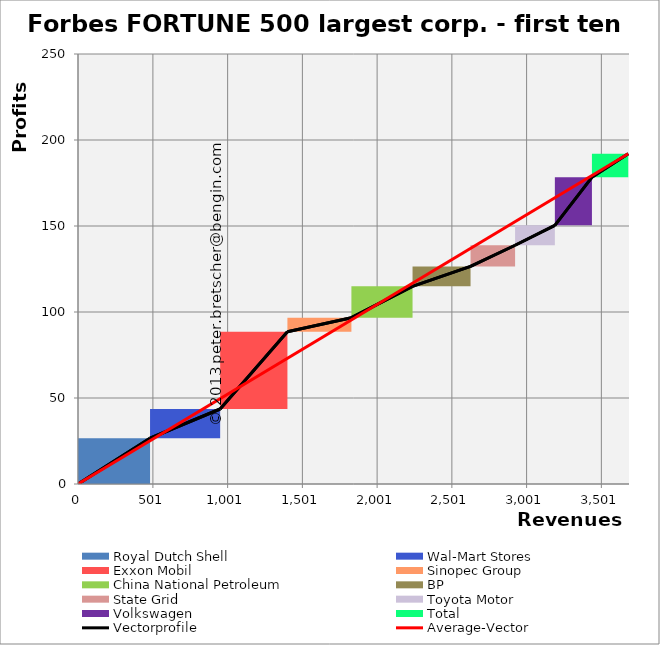
| Category | transparent | Royal Dutch Shell | Wal-Mart Stores | Exxon Mobil | Sinopec Group | China National Petroleum | BP | State Grid | Toyota Motor | Volkswagen | Total | Border right & top |
|---|---|---|---|---|---|---|---|---|---|---|---|---|
| 0.0 | 0 | 26.6 | 0 | 0 | 0 | 0 | 0 | 0 | 0 | 0 | 0 | 0 |
| 481.7 | 0 | 26.6 | 0 | 0 | 0 | 0 | 0 | 0 | 0 | 0 | 0 | 0 |
| 481.7 | 26.6 | 0 | 17 | 0 | 0 | 0 | 0 | 0 | 0 | 0 | 0 | 0 |
| 950.9 | 26.6 | 0 | 17 | 0 | 0 | 0 | 0 | 0 | 0 | 0 | 0 | 0 |
| 950.9 | 43.6 | 0 | 0 | 44.9 | 0 | 0 | 0 | 0 | 0 | 0 | 0 | 0 |
| 1400.8 | 43.6 | 0 | 0 | 44.9 | 0 | 0 | 0 | 0 | 0 | 0 | 0 | 0 |
| 1400.8 | 88.5 | 0 | 0 | 0 | 8.2 | 0 | 0 | 0 | 0 | 0 | 0 | 0 |
| 1829.0 | 88.5 | 0 | 0 | 0 | 8.2 | 0 | 0 | 0 | 0 | 0 | 0 | 0 |
| 1829.0 | 96.7 | 0 | 0 | 0 | 0 | 18.2 | 0 | 0 | 0 | 0 | 0 | 0 |
| 2237.6 | 96.7 | 0 | 0 | 0 | 0 | 18.2 | 0 | 0 | 0 | 0 | 0 | 0 |
| 2237.6 | 114.9 | 0 | 0 | 0 | 0 | 0 | 11.6 | 0 | 0 | 0 | 0 | 0 |
| 2625.9 | 114.9 | 0 | 0 | 0 | 0 | 0 | 11.6 | 0 | 0 | 0 | 0 | 0 |
| 2625.9 | 126.5 | 0 | 0 | 0 | 0 | 0 | 0 | 12.3 | 0 | 0 | 0 | 0 |
| 2924.3 | 126.5 | 0 | 0 | 0 | 0 | 0 | 0 | 12.3 | 0 | 0 | 0 | 0 |
| 2924.3 | 138.8 | 0 | 0 | 0 | 0 | 0 | 0 | 0 | 11.6 | 0 | 0 | 0 |
| 3190.0 | 138.8 | 0 | 0 | 0 | 0 | 0 | 0 | 0 | 11.6 | 0 | 0 | 0 |
| 3190.0 | 150.4 | 0 | 0 | 0 | 0 | 0 | 0 | 0 | 0 | 27.9 | 0 | 0 |
| 3437.6 | 150.4 | 0 | 0 | 0 | 0 | 0 | 0 | 0 | 0 | 27.9 | 0 | 0 |
| 3437.6 | 178.3 | 0 | 0 | 0 | 0 | 0 | 0 | 0 | 0 | 0 | 13.7 | 0 |
| 3680.9 | 178.3 | 0 | 0 | 0 | 0 | 0 | 0 | 0 | 0 | 0 | 13.7 | 0 |
| 3680.9 | 192 | 0 | 0 | 0 | 0 | 0 | 0 | 0 | 0 | 0 | 0 | 0 |
| 3685.9 | 192 | 0 | 0 | 0 | 0 | 0 | 0 | 0 | 0 | 0 | 0 | 0 |
| 3685.9 | 192 | 0 | 0 | 0 | 0 | 0 | 0 | 0 | 0 | 0 | 0 | 0 |